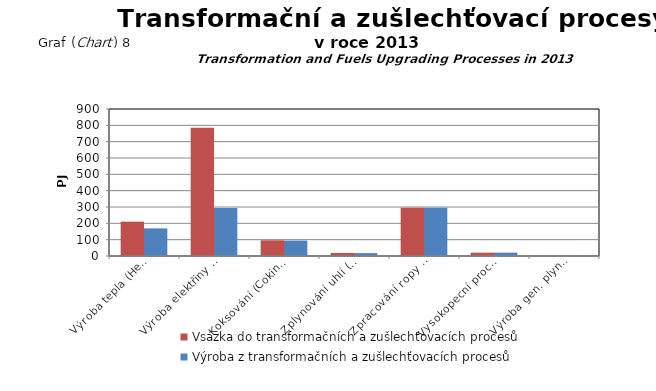
| Category | Vsázka do transformačních a zušlechťovacích procesů | Výroba z transformačních a zušlechťovacích procesů |
|---|---|---|
| Výroba tepla (Heat Production) | 210.347 | 169.046 |
| Výroba elektřiny (Electricity Production) | 785.302 | 293.918 |
| Koksování (Coking Plants) | 96.043 | 94.356 |
| Zplynování uhlí (Gasificat.of Coal) | 18.749 | 17.672 |
| Zpracování ropy (Liquid Fuels Prod.) | 295.026 | 294.765 |
| Vysokopecní proc. (Blast Furnaces) | 20.513 | 20.513 |
| Výroba gen. plynu a energoplynu (Generat. Stations) | 3.015 | 2.486 |